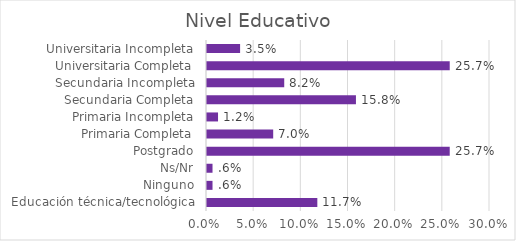
| Category | Series 0 |
|---|---|
| Educación técnica/tecnológica | 0.117 |
| Ninguno | 0.006 |
| Ns/Nr | 0.006 |
| Postgrado | 0.257 |
| Primaria Completa | 0.07 |
| Primaria Incompleta | 0.012 |
| Secundaria Completa | 0.158 |
| Secundaria Incompleta | 0.082 |
| Universitaria Completa | 0.257 |
| Universitaria Incompleta | 0.035 |